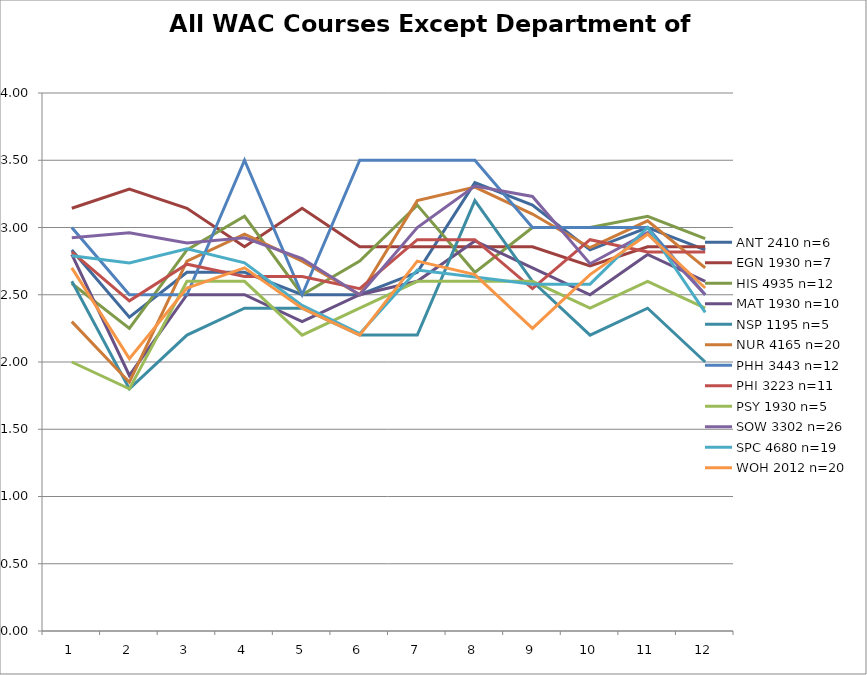
| Category | ANT 2410 n=6 | EGN 1930 n=7 | HIS 4935 n=12 | MAT 1930 n=10 | NSP 1195 n=5 | NUR 4165 n=20 | PHH 3443 n=12 | PHI 3223 n=11 | PSY 1930 n=5 | SOW 3302 n=26 | SPC 4680 n=19 | WOH 2012 n=20 |
|---|---|---|---|---|---|---|---|---|---|---|---|---|
| 0 | 2.833 | 3.143 | 2.583 | 2.8 | 2.6 | 2.3 | 3 | 2.818 | 2 | 2.923 | 2.789 | 2.7 |
| 1 | 2.333 | 3.286 | 2.25 | 1.9 | 1.8 | 1.85 | 2.5 | 2.455 | 1.8 | 2.962 | 2.737 | 2.025 |
| 2 | 2.667 | 3.143 | 2.833 | 2.5 | 2.2 | 2.75 | 2.5 | 2.727 | 2.6 | 2.885 | 2.842 | 2.55 |
| 3 | 2.667 | 2.857 | 3.083 | 2.5 | 2.4 | 2.95 | 3.5 | 2.636 | 2.6 | 2.923 | 2.737 | 2.7 |
| 4 | 2.5 | 3.143 | 2.5 | 2.3 | 2.4 | 2.75 | 2.5 | 2.636 | 2.2 | 2.769 | 2.421 | 2.4 |
| 5 | 2.5 | 2.857 | 2.75 | 2.5 | 2.2 | 2.5 | 3.5 | 2.545 | 2.4 | 2.5 | 2.211 | 2.2 |
| 6 | 2.667 | 2.857 | 3.167 | 2.6 | 2.2 | 3.2 | 3.5 | 2.909 | 2.6 | 3 | 2.684 | 2.75 |
| 7 | 3.333 | 2.857 | 2.667 | 2.9 | 3.2 | 3.3 | 3.5 | 2.909 | 2.6 | 3.308 | 2.632 | 2.65 |
| 8 | 3.167 | 2.857 | 3 | 2.7 | 2.6 | 3.1 | 3 | 2.545 | 2.6 | 3.231 | 2.579 | 2.25 |
| 9 | 2.833 | 2.714 | 3 | 2.5 | 2.2 | 2.85 | 3 | 2.909 | 2.4 | 2.731 | 2.579 | 2.65 |
| 10 | 3 | 2.857 | 3.083 | 2.8 | 2.4 | 3.05 | 3 | 2.818 | 2.6 | 2.962 | 3 | 2.95 |
| 11 | 2.833 | 2.857 | 2.917 | 2.6 | 2 | 2.7 | 2.5 | 2.818 | 2.4 | 2.5 | 2.368 | 2.55 |